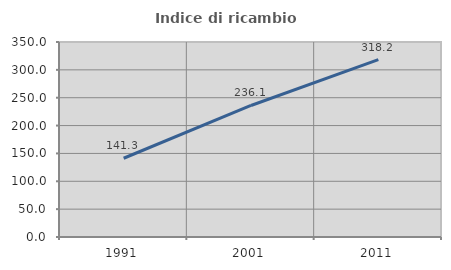
| Category | Indice di ricambio occupazionale  |
|---|---|
| 1991.0 | 141.337 |
| 2001.0 | 236.066 |
| 2011.0 | 318.214 |